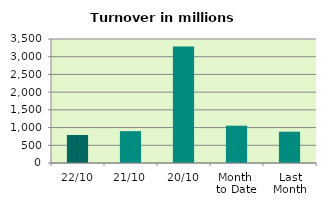
| Category | Series 0 |
|---|---|
| 22/10 | 790.426 |
| 21/10 | 899.311 |
| 20/10 | 3285.78 |
| Month 
to Date | 1052.866 |
| Last
Month | 883.598 |